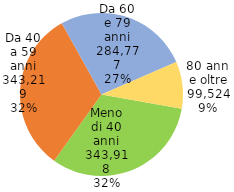
| Category | Series 0 |
|---|---|
| Meno di 40 anni | 343918 |
| Da 40 a 59 anni | 343219 |
| Da 60 e 79 anni | 284777 |
| 80 anni e oltre | 99524 |